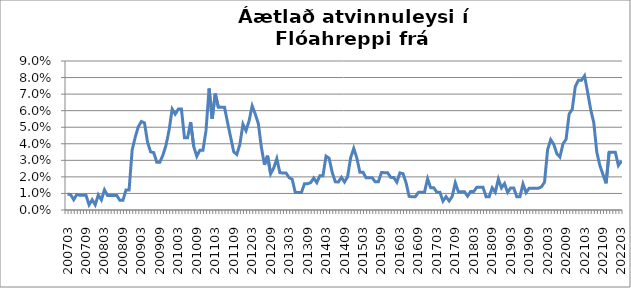
| Category | Series 0 |
|---|---|
| 200703 | 0.01 |
| 200704 | 0.009 |
| 200705 | 0.006 |
| 200706 | 0.009 |
| 200707 | 0.009 |
| 200708 | 0.009 |
| 200709 | 0.009 |
| 200710 | 0.003 |
| 200711 | 0.006 |
| 200712 | 0.003 |
| 200801 | 0.009 |
| 200802 | 0.006 |
| 200803 | 0.012 |
| 200804 | 0.009 |
| 200805 | 0.009 |
| 200806 | 0.009 |
| 200807 | 0.009 |
| 200808 | 0.006 |
| 200809 | 0.006 |
| 200810 | 0.012 |
| 200811 | 0.012 |
| 200812 | 0.036 |
| 200901 | 0.044 |
| 200902 | 0.05 |
| 200903 | 0.053 |
| 200904 | 0.053 |
| 200905 | 0.041 |
| 200906 | 0.035 |
| 200907 | 0.035 |
| 200908 | 0.029 |
| 200909 | 0.029 |
| 200910 | 0.033 |
| 200911 | 0.039 |
| 200912 | 0.048 |
| 201001 | 0.061 |
| 201002 | 0.058 |
| 201003 | 0.061 |
| 201004 | 0.061 |
| 201005 | 0.044 |
| 201006 | 0.044 |
| 201007 | 0.053 |
| 201008 | 0.038 |
| 201009 | 0.032 |
| 201010 | 0.036 |
| 201011 | 0.036 |
| 201012 | 0.048 |
| 201101 | 0.073 |
| 201102 | 0.055 |
| 201103 | 0.07 |
| 201104 | 0.062 |
| 201105 | 0.062 |
| 201106 | 0.062 |
| 201107 | 0.053 |
| 201108 | 0.044 |
| 201109 | 0.035 |
| 201110 | 0.034 |
| 201111 | 0.04 |
| 201112 | 0.052 |
| 201201 | 0.048 |
| 201202 | 0.054 |
| 201203 | 0.063 |
| 201204 | 0.058 |
| 201205 | 0.052 |
| 201206 | 0.038 |
| 201207 | 0.027 |
| 201208 | 0.033 |
| 201209 | 0.022 |
| 201210 | 0.025 |
| 201211 | 0.031 |
| 201212 | 0.023 |
| 201301 | 0.022 |
| 201302 | 0.022 |
| 201303 | 0.02 |
| 201304 | 0.019 |
| 201305 | 0.011 |
| 201306 | 0.011 |
| 201307 | 0.011 |
| 201308 | 0.016 |
| 201309 | 0.016 |
| 201310 | 0.017 |
| 201311 | 0.019 |
| 201312 | 0.017 |
| 201401 | 0.021 |
| 201402 | 0.021 |
| 201403 | 0.033 |
| 201404 | 0.031 |
| 201405 | 0.023 |
| 201406 | 0.017 |
| 201407 | 0.017 |
| 201408 | 0.02 |
| 201409 | 0.017 |
| 201410 | 0.02 |
| 201411 | 0.032 |
| 201412 | 0.037 |
| 201501 | 0.031 |
| 201502 | 0.023 |
| 201503 | 0.023 |
| 201504 | 0.019 |
| 201505 | 0.019 |
| 201506 | 0.019 |
| 201507 | 0.017 |
| 201508 | 0.017 |
| 201509 | 0.023 |
| 201510 | 0.023 |
| 201511 | 0.023 |
| 201512 | 0.02 |
| 201601 | 0.02 |
| 201602 | 0.017 |
| 201603 | 0.022 |
| 201604 | 0.022 |
| 201605 | 0.016 |
| 201606 | 0.008 |
| 201607 | 0.008 |
| 201608 | 0.008 |
| 201609 | 0.011 |
| 201610 | 0.011 |
| 201611 | 0.011 |
| 201612 | 0.019 |
| 201701 | 0.013 |
| 201702 | 0.013 |
| 201703 | 0.011 |
| 201704 | 0.011 |
| 201705 | 0.005 |
| 201706 | 0.008 |
| 201707 | 0.005 |
| 201708 | 0.008 |
| 201709 | 0.016 |
| 201710 | 0.011 |
| 201711 | 0.011 |
| 201712 | 0.011 |
| 201801 | 0.008 |
| 201802 | 0.011 |
| 201803 | 0.011 |
| 201804 | 0.014 |
| 201805 | 0.014 |
| 201806 | 0.014 |
| 201807 | 0.008 |
| 201808 | 0.008 |
| 201809 | 0.013 |
| 201810 | 0.011 |
| 201811 | 0.019 |
| 201812 | 0.013 |
| 201901 | 0.016 |
| 201902 | 0.011 |
| 201903 | 0.013 |
| 201904 | 0.013 |
| 201905 | 0.008 |
| 201906 | 0.008 |
| 201907 | 0.016 |
| 201908 | 0.01 |
| 201909 | 0.013 |
| 201910 | 0.013 |
| 201911 | 0.013 |
| 201912 | 0.013 |
| 202001 | 0.014 |
| 202002 | 0.017 |
| 202003 | 0.036 |
| 202004 | 0.042 |
| 202005 | 0.04 |
| 202006 | 0.034 |
| 202007 | 0.032 |
| 202008 | 0.04 |
| 202009 | 0.043 |
| 202010 | 0.058 |
| 202011 | 0.061 |
| 202012 | 0.075 |
| 202101 | 0.078 |
| 202102 | 0.078 |
| 202103 | 0.081 |
| 202104 | 0.071 |
| 202105 | 0.061 |
| 202106 | 0.053 |
| 202107 | 0.035 |
| 202108 | 0.027 |
| 202109 | 0.021 |
| 202110 | 0.016 |
| 202111 | 0.035 |
| 202112 | 0.035 |
| 202201 | 0.035 |
| 202202 | 0.027 |
| 202203 | 0.03 |